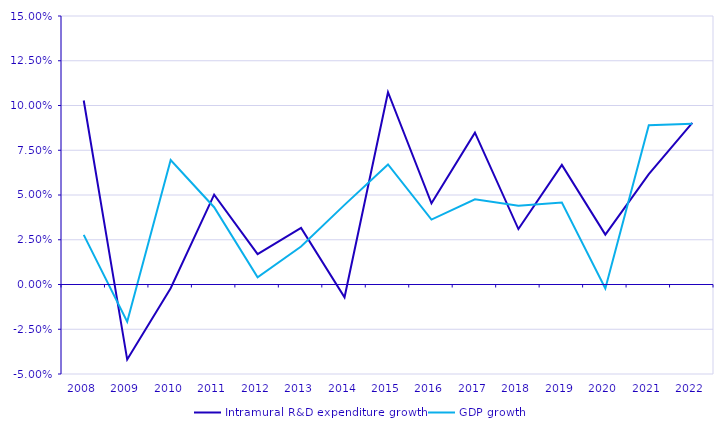
| Category | Intramural R&D expenditure growth | GDP growth |
|---|---|---|
| 2008 | 0.103 | 0.028 |
| 2009 | -0.042 | -0.021 |
| 2010 | -0.002 | 0.07 |
| 2011 | 0.05 | 0.043 |
| 2012 | 0.017 | 0.004 |
| 2013 | 0.032 | 0.021 |
| 2014 | -0.007 | 0.044 |
| 2015 | 0.107 | 0.067 |
| 2016 | 0.045 | 0.036 |
| 2017 | 0.085 | 0.048 |
| 2018 | 0.031 | 0.044 |
| 2019 | 0.067 | 0.046 |
| 2020 | 0.028 | -0.002 |
| 2021 | 0.062 | 0.089 |
| 2022 | 0.09 | 0.09 |